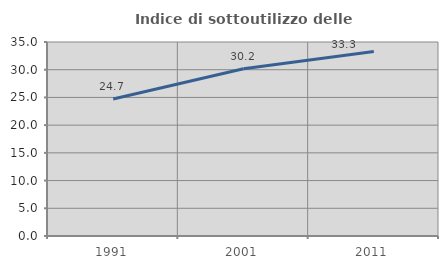
| Category | Indice di sottoutilizzo delle abitazioni  |
|---|---|
| 1991.0 | 24.718 |
| 2001.0 | 30.174 |
| 2011.0 | 33.293 |